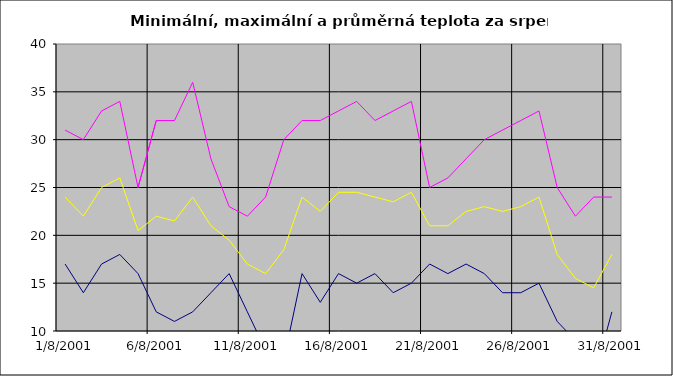
| Category | Series 0 | Series 1 | Series 2 |
|---|---|---|---|
| 2001-08-01 | 17 | 31 | 24 |
| 2001-08-02 | 14 | 30 | 22 |
| 2001-08-03 | 17 | 33 | 25 |
| 2001-08-04 | 18 | 34 | 26 |
| 2001-08-05 | 16 | 25 | 20.5 |
| 2001-08-06 | 12 | 32 | 22 |
| 2001-08-07 | 11 | 32 | 21.5 |
| 2001-08-08 | 12 | 36 | 24 |
| 2001-08-09 | 14 | 28 | 21 |
| 2001-08-10 | 16 | 23 | 19.5 |
| 2001-08-11 | 12 | 22 | 17 |
| 2001-08-12 | 8 | 24 | 16 |
| 2001-08-13 | 7 | 30 | 18.5 |
| 2001-08-14 | 16 | 32 | 24 |
| 2001-08-15 | 13 | 32 | 22.5 |
| 2001-08-16 | 16 | 33 | 24.5 |
| 2001-08-17 | 15 | 34 | 24.5 |
| 2001-08-18 | 16 | 32 | 24 |
| 2001-08-19 | 14 | 33 | 23.5 |
| 2001-08-20 | 15 | 34 | 24.5 |
| 2001-08-21 | 17 | 25 | 21 |
| 2001-08-22 | 16 | 26 | 21 |
| 2001-08-23 | 17 | 28 | 22.5 |
| 2001-08-24 | 16 | 30 | 23 |
| 2001-08-25 | 14 | 31 | 22.5 |
| 2001-08-26 | 14 | 32 | 23 |
| 2001-08-27 | 15 | 33 | 24 |
| 2001-08-28 | 11 | 25 | 18 |
| 2001-08-29 | 9 | 22 | 15.5 |
| 2001-08-30 | 5 | 24 | 14.5 |
| 2001-08-31 | 12 | 24 | 18 |